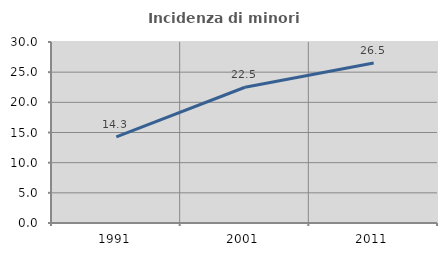
| Category | Incidenza di minori stranieri |
|---|---|
| 1991.0 | 14.286 |
| 2001.0 | 22.5 |
| 2011.0 | 26.506 |